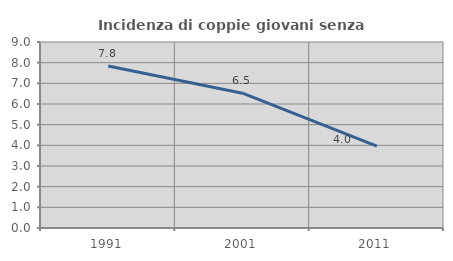
| Category | Incidenza di coppie giovani senza figli |
|---|---|
| 1991.0 | 7.841 |
| 2001.0 | 6.524 |
| 2011.0 | 3.961 |